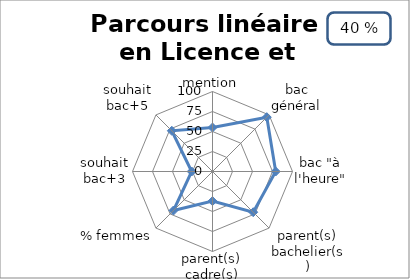
| Category | Parcours linéaire en Licence et Master  |
|---|---|
| mention | 55 |
| bac général | 96 |
| bac "à l'heure" | 79 |
| parent(s) bachelier(s) | 72 |
| parent(s) cadre(s) | 37 |
| % femmes | 69 |
| souhait bac+3 | 26 |
| souhait bac+5 | 72 |